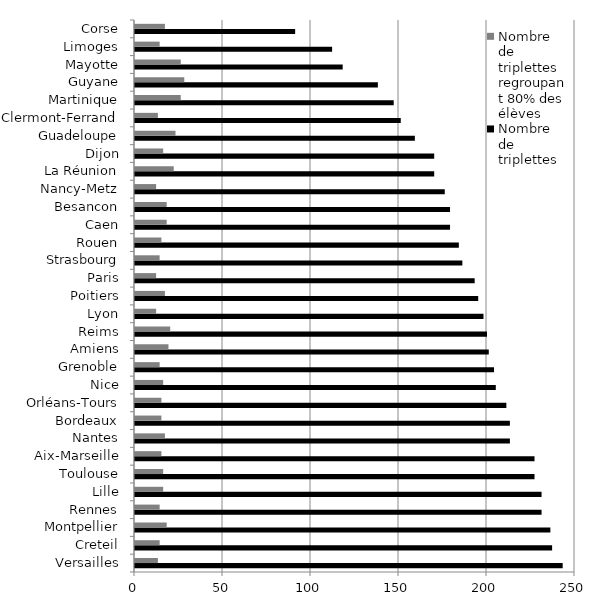
| Category | Nombre de triplettes | Nombre de triplettes regroupant 80% des élèves |
|---|---|---|
| Versailles | 243 | 13 |
| Creteil | 237 | 14 |
| Montpellier | 236 | 18 |
| Rennes | 231 | 14 |
| Lille | 231 | 16 |
| Toulouse | 227 | 16 |
| Aix-Marseille | 227 | 15 |
| Nantes | 213 | 17 |
| Bordeaux | 213 | 15 |
| Orléans-Tours | 211 | 15 |
| Nice | 205 | 16 |
| Grenoble | 204 | 14 |
| Amiens | 201 | 19 |
| Reims | 200 | 20 |
| Lyon | 198 | 12 |
| Poitiers | 195 | 17 |
| Paris | 193 | 12 |
| Strasbourg | 186 | 14 |
| Rouen | 184 | 15 |
| Caen | 179 | 18 |
| Besancon | 179 | 18 |
| Nancy-Metz | 176 | 12 |
| La Réunion | 170 | 22 |
| Dijon | 170 | 16 |
| Guadeloupe | 159 | 23 |
| Clermont-Ferrand | 151 | 13 |
| Martinique | 147 | 26 |
| Guyane | 138 | 28 |
| Mayotte | 118 | 26 |
| Limoges | 112 | 14 |
| Corse | 91 | 17 |